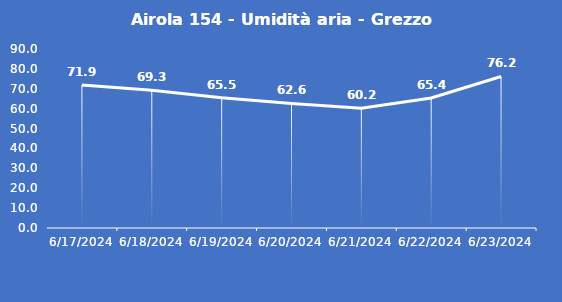
| Category | Airola 154 - Umidità aria - Grezzo (%) |
|---|---|
| 6/17/24 | 71.9 |
| 6/18/24 | 69.3 |
| 6/19/24 | 65.5 |
| 6/20/24 | 62.6 |
| 6/21/24 | 60.2 |
| 6/22/24 | 65.4 |
| 6/23/24 | 76.2 |